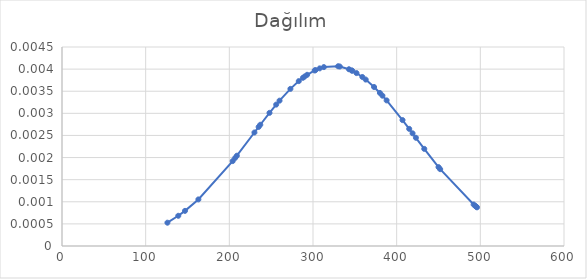
| Category | Dağılım |
|---|---|
| 126.0 | 0.001 |
| 139.0 | 0.001 |
| 147.0 | 0.001 |
| 163.0 | 0.001 |
| 204.0 | 0.002 |
| 207.0 | 0.002 |
| 209.0 | 0.002 |
| 230.0 | 0.003 |
| 235.0 | 0.003 |
| 237.0 | 0.003 |
| 248.0 | 0.003 |
| 256.0 | 0.003 |
| 260.0 | 0.003 |
| 273.0 | 0.004 |
| 283.0 | 0.004 |
| 288.0 | 0.004 |
| 290.0 | 0.004 |
| 293.0 | 0.004 |
| 302.0 | 0.004 |
| 303.0 | 0.004 |
| 308.0 | 0.004 |
| 313.0 | 0.004 |
| 330.0 | 0.004 |
| 332.0 | 0.004 |
| 343.0 | 0.004 |
| 346.0 | 0.004 |
| 347.0 | 0.004 |
| 352.0 | 0.004 |
| 359.0 | 0.004 |
| 363.0 | 0.004 |
| 373.0 | 0.004 |
| 380.0 | 0.003 |
| 383.0 | 0.003 |
| 388.0 | 0.003 |
| 407.0 | 0.003 |
| 415.0 | 0.003 |
| 419.0 | 0.003 |
| 423.0 | 0.002 |
| 433.0 | 0.002 |
| 450.0 | 0.002 |
| 452.0 | 0.002 |
| 492.0 | 0.001 |
| 494.0 | 0.001 |
| 495.0 | 0.001 |
| 496.0 | 0.001 |